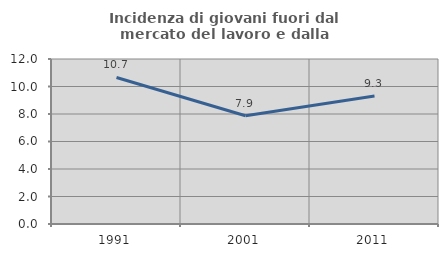
| Category | Incidenza di giovani fuori dal mercato del lavoro e dalla formazione  |
|---|---|
| 1991.0 | 10.656 |
| 2001.0 | 7.872 |
| 2011.0 | 9.302 |